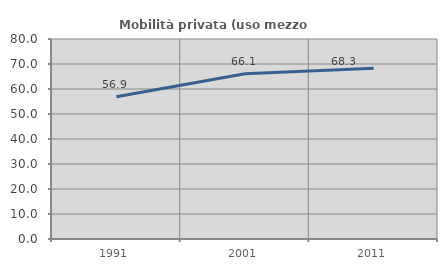
| Category | Mobilità privata (uso mezzo privato) |
|---|---|
| 1991.0 | 56.86 |
| 2001.0 | 66.078 |
| 2011.0 | 68.28 |